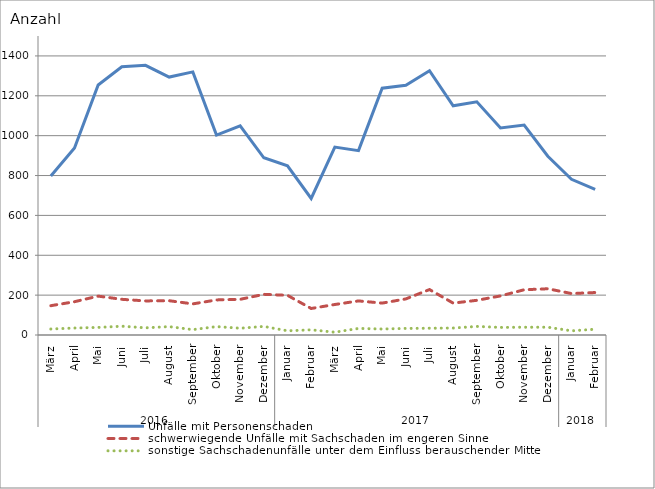
| Category | Unfälle mit Personenschaden | schwerwiegende Unfälle mit Sachschaden im engeren Sinne | sonstige Sachschadenunfälle unter dem Einfluss berauschender Mittel |
|---|---|---|---|
| 0 | 798 | 147 | 30 |
| 1 | 938 | 167 | 35 |
| 2 | 1254 | 195 | 38 |
| 3 | 1346 | 179 | 44 |
| 4 | 1353 | 171 | 36 |
| 5 | 1294 | 172 | 42 |
| 6 | 1320 | 156 | 27 |
| 7 | 1003 | 176 | 42 |
| 8 | 1049 | 179 | 34 |
| 9 | 889 | 204 | 43 |
| 10 | 849 | 199 | 21 |
| 11 | 685 | 133 | 26 |
| 12 | 943 | 153 | 14 |
| 13 | 925 | 171 | 33 |
| 14 | 1238 | 160 | 30 |
| 15 | 1253 | 181 | 33 |
| 16 | 1326 | 228 | 34 |
| 17 | 1150 | 160 | 35 |
| 18 | 1170 | 174 | 43 |
| 19 | 1039 | 196 | 38 |
| 20 | 1053 | 227 | 39 |
| 21 | 897 | 232 | 39 |
| 22 | 781 | 208 | 21 |
| 23 | 730 | 213 | 29 |